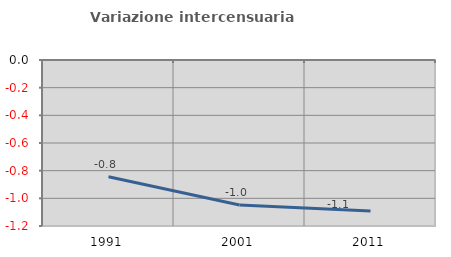
| Category | Variazione intercensuaria annua |
|---|---|
| 1991.0 | -0.844 |
| 2001.0 | -1.048 |
| 2011.0 | -1.092 |